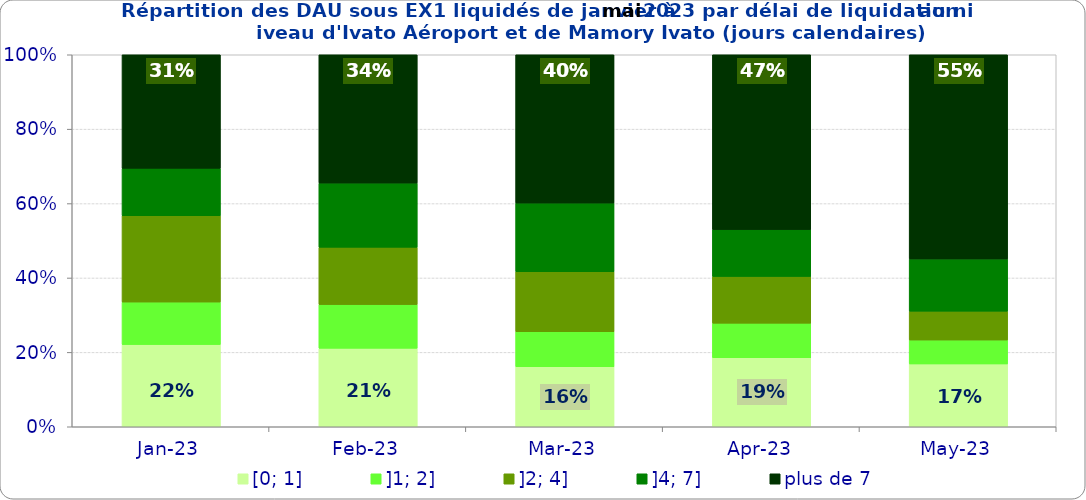
| Category | [0; 1] | ]1; 2] | ]2; 4] | ]4; 7] | plus de 7 |
|---|---|---|---|---|---|
| 2023-01-01 | 0.221 | 0.114 | 0.232 | 0.127 | 0.305 |
| 2023-02-01 | 0.211 | 0.117 | 0.154 | 0.172 | 0.345 |
| 2023-03-01 | 0.161 | 0.094 | 0.161 | 0.185 | 0.399 |
| 2023-04-01 | 0.186 | 0.093 | 0.126 | 0.126 | 0.47 |
| 2023-05-01 | 0.169 | 0.064 | 0.078 | 0.14 | 0.549 |